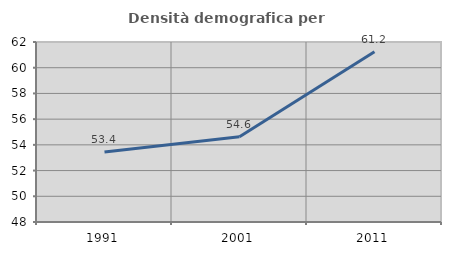
| Category | Densità demografica |
|---|---|
| 1991.0 | 53.443 |
| 2001.0 | 54.638 |
| 2011.0 | 61.24 |